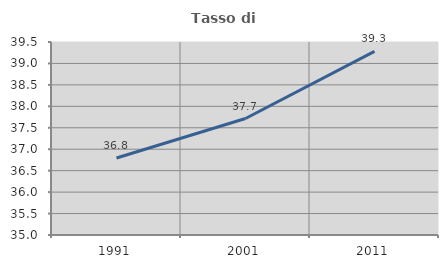
| Category | Tasso di occupazione   |
|---|---|
| 1991.0 | 36.796 |
| 2001.0 | 37.716 |
| 2011.0 | 39.281 |